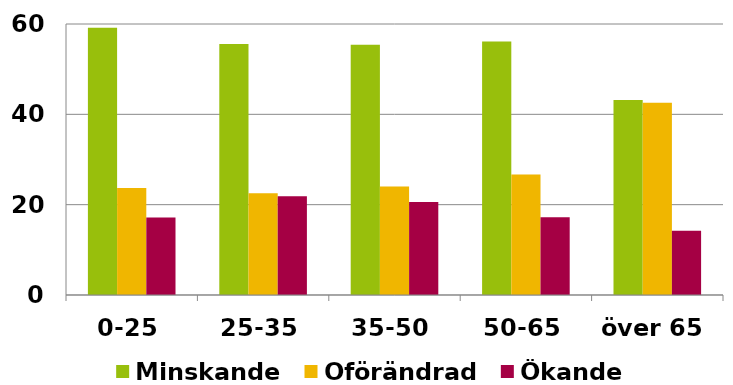
| Category | Minskande | Oförändrad | Ökande |
|---|---|---|---|
| 0-25 | 59.165 | 23.666 | 17.169 |
| 25-35 | 55.599 | 22.516 | 21.885 |
| 35-50 | 55.39 | 24.028 | 20.582 |
| 50-65 | 56.115 | 26.685 | 17.199 |
| över 65 | 43.196 | 42.586 | 14.218 |